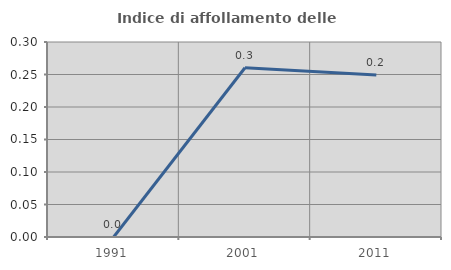
| Category | Indice di affollamento delle abitazioni  |
|---|---|
| 1991.0 | 0 |
| 2001.0 | 0.26 |
| 2011.0 | 0.249 |